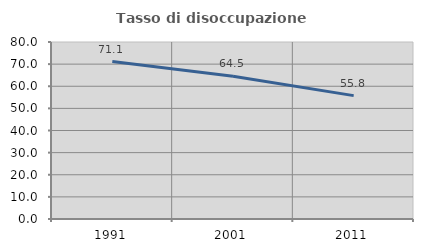
| Category | Tasso di disoccupazione giovanile  |
|---|---|
| 1991.0 | 71.141 |
| 2001.0 | 64.516 |
| 2011.0 | 55.769 |